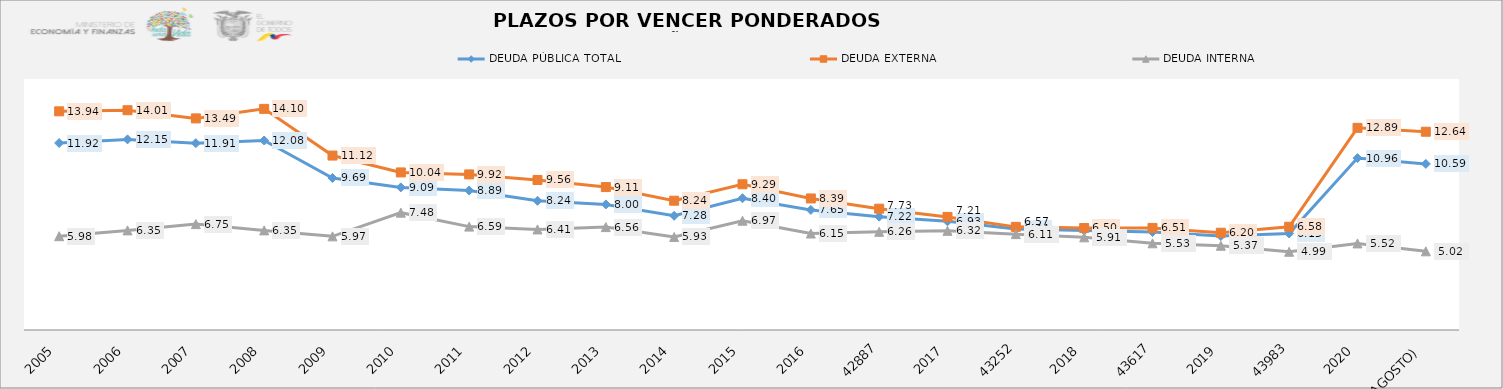
| Category | DEUDA PÚBLICA TOTAL | DEUDA EXTERNA  | DEUDA INTERNA |
|---|---|---|---|
| 2005 | 11.92 | 13.939 | 5.98 |
| 2006 | 12.15 | 14.01 | 6.35 |
| 2007 | 11.91 | 13.489 | 6.75 |
| 2008 | 12.08 | 14.097 | 6.35 |
| 2009 | 9.69 | 11.12 | 5.97 |
| 2010 | 9.09 | 10.045 | 7.48 |
| 2011 | 8.889 | 9.918 | 6.59 |
| 2012 | 8.237 | 9.564 | 6.41 |
| 2013 | 8.003 | 9.112 | 6.56 |
| 2014 | 7.278 | 8.241 | 5.93 |
| 2015 | 8.401 | 9.29 | 6.969 |
| 2016 | 7.655 | 8.385 | 6.149 |
| 42887 | 7.224 | 7.733 | 6.257 |
| 2017 | 6.927 | 7.21 | 6.32 |
| 43252 | 6.439 | 6.574 | 6.111 |
| 2018 | 6.337 | 6.503 | 5.906 |
| 43617 | 6.246 | 6.509 | 5.526 |
| 2019 | 5.988 | 6.201 | 5.368 |
| 43983 | 6.152 | 6.581 | 4.989 |
| 2020 | 10.957 | 12.887 | 5.519 |
| 2021 (AGOSTO) | 10.589 | 12.639 | 5.015 |